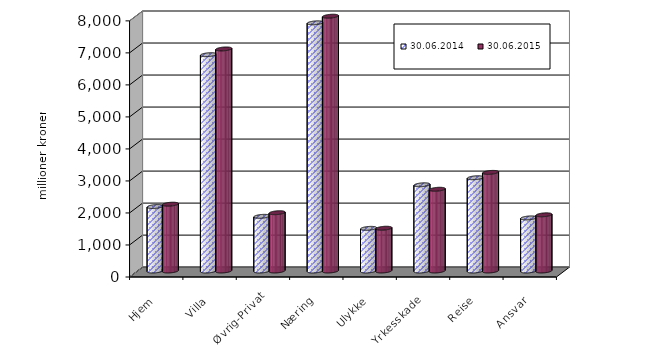
| Category | 30.06.2014 | 30.06.2015 |
|---|---|---|
| Hjem | 2013.498 | 2086.686 |
| Villa | 6756.81 | 6935.602 |
| Øvrig-Privat | 1707.462 | 1820.929 |
| Næring | 7751.451 | 7958.27 |
| Ulykke | 1332.238 | 1336.004 |
| Yrkesskade | 2692.389 | 2553.225 |
| Reise | 2912.822 | 3080.139 |
| Ansvar | 1657.861 | 1755.221 |